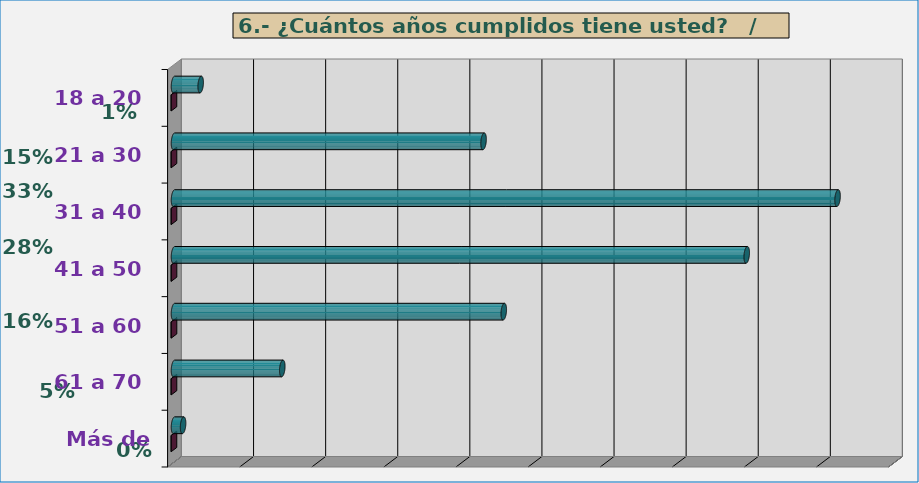
| Category | Series 0 | Series 1 |
|---|---|---|
| 18 a 20 | 185 | 0.013 |
| 21 a 30 | 2147 | 0.153 |
| 31 a 40 | 4602 | 0.329 |
| 41 a 50 | 3972 | 0.284 |
| 51 a 60 | 2287 | 0.163 |
| 61 a 70 | 751 | 0.054 |
| Más de 70 | 63 | 0.004 |